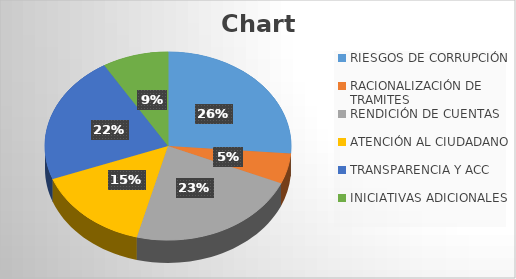
| Category | Series 0 |
|---|---|
| RIESGOS DE CORRUPCIÓN | 1 |
| RACIONALIZACIÓN DE TRAMITES | 0.2 |
| RENDICIÓN DE CUENTAS | 0.86 |
| ATENCIÓN AL CIUDADANO | 0.58 |
| TRANSPARENCIA Y ACC | 0.84 |
| INICIATIVAS ADICIONALES | 0.33 |